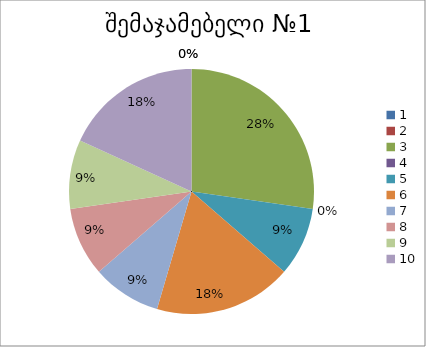
| Category | რაოდენობა | ქულა |
|---|---|---|
| 0 | 0 | 1 |
| 1 | 0 | 2 |
| 2 | 3 | 3 |
| 3 | 0 | 4 |
| 4 | 1 | 5 |
| 5 | 2 | 6 |
| 6 | 1 | 7 |
| 7 | 1 | 8 |
| 8 | 1 | 9 |
| 9 | 2 | 10 |